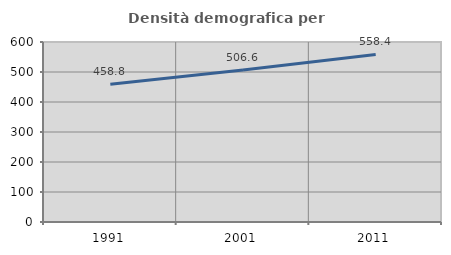
| Category | Densità demografica |
|---|---|
| 1991.0 | 458.842 |
| 2001.0 | 506.64 |
| 2011.0 | 558.391 |